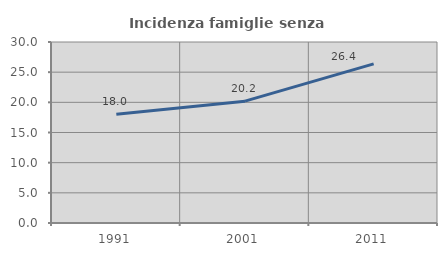
| Category | Incidenza famiglie senza nuclei |
|---|---|
| 1991.0 | 18.037 |
| 2001.0 | 20.194 |
| 2011.0 | 26.383 |